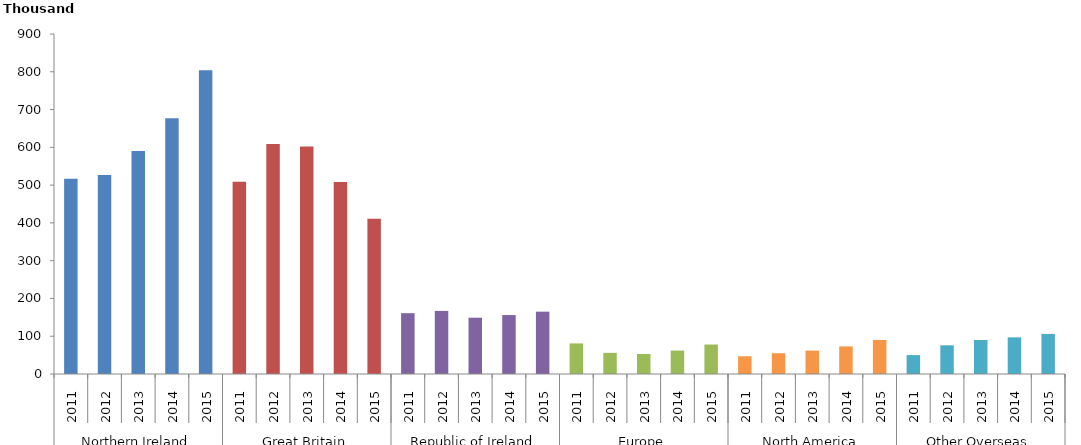
| Category | Number |
|---|---|
| 0 | 517 |
| 1 | 527 |
| 2 | 590 |
| 3 | 677 |
| 4 | 804 |
| 5 | 509 |
| 6 | 609 |
| 7 | 602 |
| 8 | 508 |
| 9 | 411 |
| 10 | 161 |
| 11 | 167 |
| 12 | 149 |
| 13 | 156 |
| 14 | 165 |
| 15 | 81 |
| 16 | 56 |
| 17 | 53 |
| 18 | 62 |
| 19 | 78 |
| 20 | 47 |
| 21 | 55 |
| 22 | 62 |
| 23 | 73 |
| 24 | 90 |
| 25 | 50 |
| 26 | 76 |
| 27 | 90 |
| 28 | 97 |
| 29 | 106 |